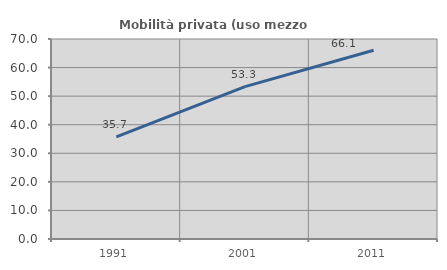
| Category | Mobilità privata (uso mezzo privato) |
|---|---|
| 1991.0 | 35.714 |
| 2001.0 | 53.333 |
| 2011.0 | 66.071 |